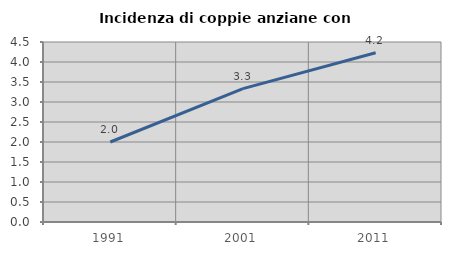
| Category | Incidenza di coppie anziane con figli |
|---|---|
| 1991.0 | 2 |
| 2001.0 | 3.335 |
| 2011.0 | 4.233 |